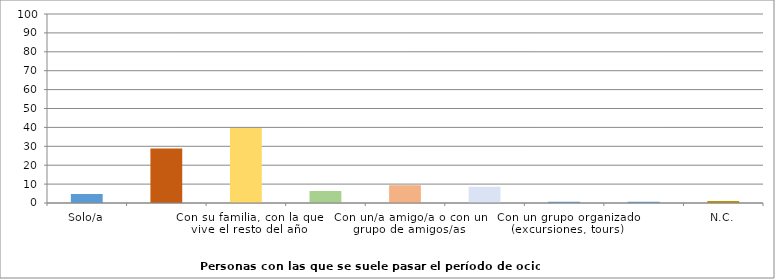
| Category | Series 0 |
|---|---|
| Solo/a | 4.7 |
| Con su pareja | 28.9 |
| Con su familia, con la que vive el resto del año | 39.7 |
| Con su familia, con la que no vive el resto del año | 6.4 |
| Con un/a amigo/a o con un grupo de amigos/as | 9.4 |
| Con su pareja y/o familia y/o amigos/as | 8.6 |
| Con un grupo organizado (excursiones, tours) | 0.6 |
| Otra respuesta | 0.6 |
| N.C. | 1 |